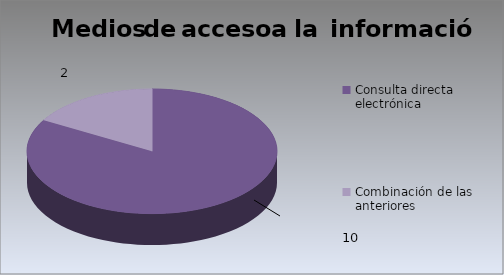
| Category | Series 0 |
|---|---|
| Consulta directa electrónica | 10 |
| Combinación de las anteriores | 2 |